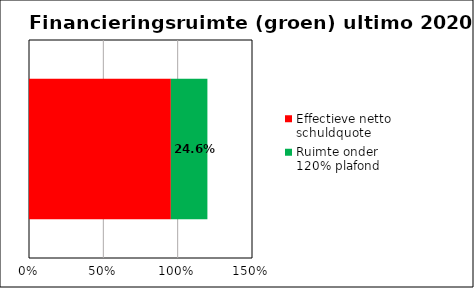
| Category | Effectieve netto schuldquote | Ruimte onder 120% plafond |
|---|---|---|
| Effectieve netto schuldquote 2020 | 0.954 | 0.246 |